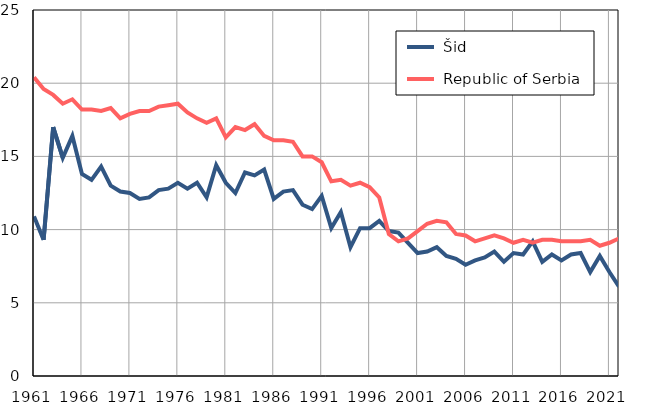
| Category |  Šid |  Republic of Serbia |
|---|---|---|
| 1961.0 | 10.9 | 20.4 |
| 1962.0 | 9.3 | 19.6 |
| 1963.0 | 17 | 19.2 |
| 1964.0 | 14.9 | 18.6 |
| 1965.0 | 16.4 | 18.9 |
| 1966.0 | 13.8 | 18.2 |
| 1967.0 | 13.4 | 18.2 |
| 1968.0 | 14.3 | 18.1 |
| 1969.0 | 13 | 18.3 |
| 1970.0 | 12.6 | 17.6 |
| 1971.0 | 12.5 | 17.9 |
| 1972.0 | 12.1 | 18.1 |
| 1973.0 | 12.2 | 18.1 |
| 1974.0 | 12.7 | 18.4 |
| 1975.0 | 12.8 | 18.5 |
| 1976.0 | 13.2 | 18.6 |
| 1977.0 | 12.8 | 18 |
| 1978.0 | 13.2 | 17.6 |
| 1979.0 | 12.2 | 17.3 |
| 1980.0 | 14.4 | 17.6 |
| 1981.0 | 13.2 | 16.3 |
| 1982.0 | 12.5 | 17 |
| 1983.0 | 13.9 | 16.8 |
| 1984.0 | 13.7 | 17.2 |
| 1985.0 | 14.1 | 16.4 |
| 1986.0 | 12.1 | 16.1 |
| 1987.0 | 12.6 | 16.1 |
| 1988.0 | 12.7 | 16 |
| 1989.0 | 11.7 | 15 |
| 1990.0 | 11.4 | 15 |
| 1991.0 | 12.3 | 14.6 |
| 1992.0 | 10.1 | 13.3 |
| 1993.0 | 11.2 | 13.4 |
| 1994.0 | 8.8 | 13 |
| 1995.0 | 10.1 | 13.2 |
| 1996.0 | 10.1 | 12.9 |
| 1997.0 | 10.6 | 12.2 |
| 1998.0 | 9.9 | 9.7 |
| 1999.0 | 9.8 | 9.2 |
| 2000.0 | 9.1 | 9.4 |
| 2001.0 | 8.4 | 9.9 |
| 2002.0 | 8.5 | 10.4 |
| 2003.0 | 8.8 | 10.6 |
| 2004.0 | 8.2 | 10.5 |
| 2005.0 | 8 | 9.7 |
| 2006.0 | 7.6 | 9.6 |
| 2007.0 | 7.9 | 9.2 |
| 2008.0 | 8.1 | 9.4 |
| 2009.0 | 8.5 | 9.6 |
| 2010.0 | 7.8 | 9.4 |
| 2011.0 | 8.4 | 9.1 |
| 2012.0 | 8.3 | 9.3 |
| 2013.0 | 9.2 | 9.1 |
| 2014.0 | 7.8 | 9.3 |
| 2015.0 | 8.3 | 9.3 |
| 2016.0 | 7.9 | 9.2 |
| 2017.0 | 8.3 | 9.2 |
| 2018.0 | 8.4 | 9.2 |
| 2019.0 | 7.1 | 9.3 |
| 2020.0 | 8.2 | 8.9 |
| 2021.0 | 7.1 | 9.1 |
| 2022.0 | 6.1 | 9.4 |